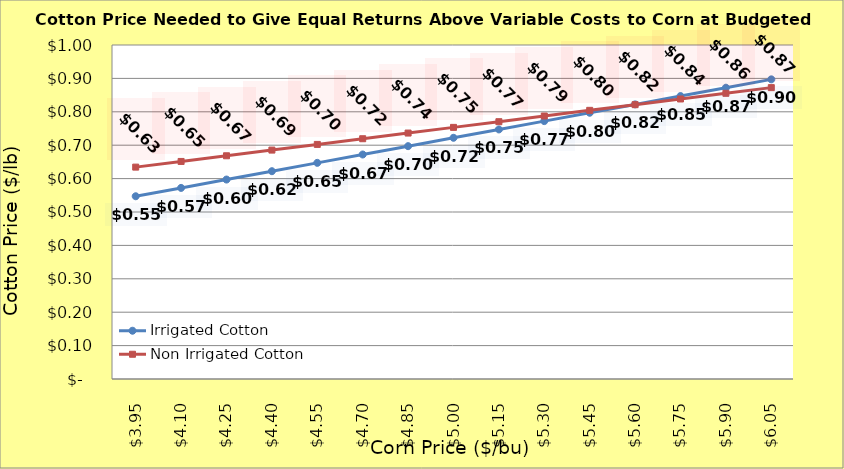
| Category | Irrigated Cotton | Non Irrigated Cotton |
|---|---|---|
| 3.949999999999998 | 0.547 | 0.634 |
| 4.099999999999998 | 0.572 | 0.651 |
| 4.249999999999998 | 0.597 | 0.668 |
| 4.399999999999999 | 0.622 | 0.685 |
| 4.549999999999999 | 0.647 | 0.702 |
| 4.699999999999999 | 0.672 | 0.719 |
| 4.85 | 0.697 | 0.736 |
| 5.0 | 0.722 | 0.753 |
| 5.15 | 0.747 | 0.77 |
| 5.300000000000001 | 0.772 | 0.787 |
| 5.450000000000001 | 0.797 | 0.804 |
| 5.600000000000001 | 0.822 | 0.821 |
| 5.750000000000002 | 0.847 | 0.838 |
| 5.900000000000002 | 0.872 | 0.855 |
| 6.0500000000000025 | 0.897 | 0.872 |